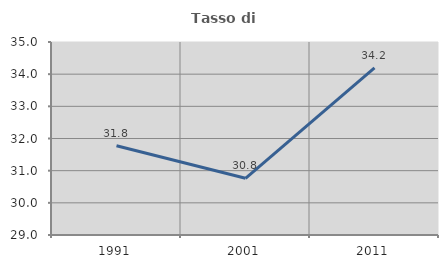
| Category | Tasso di occupazione   |
|---|---|
| 1991.0 | 31.776 |
| 2001.0 | 30.763 |
| 2011.0 | 34.196 |